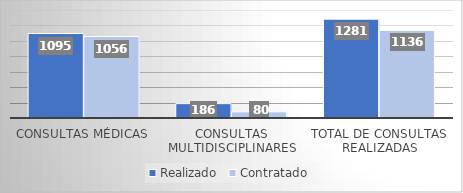
| Category | Realizado | Contratado |
|---|---|---|
| Consultas Médicas | 1095 | 1056 |
| Consultas Multidisciplinares | 186 | 80 |
| Total de Consultas Realizadas | 1281 | 1136 |